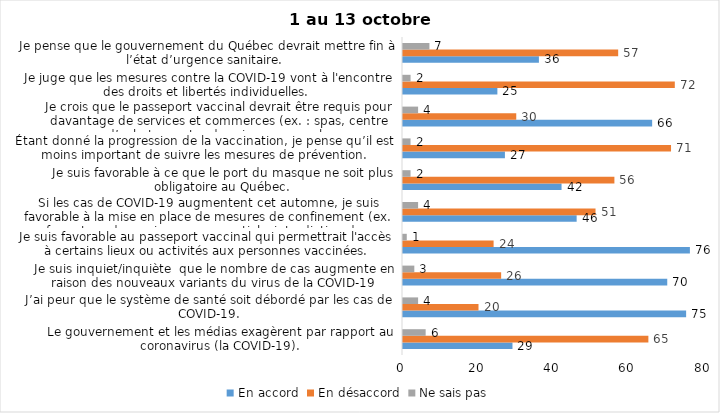
| Category | En accord | En désaccord | Ne sais pas |
|---|---|---|---|
| Le gouvernement et les médias exagèrent par rapport au coronavirus (la COVID-19). | 29 | 65 | 6 |
| J’ai peur que le système de santé soit débordé par les cas de COVID-19. | 75 | 20 | 4 |
| Je suis inquiet/inquiète  que le nombre de cas augmente en raison des nouveaux variants du virus de la COVID-19 | 70 | 26 | 3 |
| Je suis favorable au passeport vaccinal qui permettrait l'accès à certains lieux ou activités aux personnes vaccinées. | 76 | 24 | 1 |
| Si les cas de COVID-19 augmentent cet automne, je suis favorable à la mise en place de mesures de confinement (ex. fermeture de services non essentiels, interdiction des rassemblements privés) | 46 | 51 | 4 |
| Je suis favorable à ce que le port du masque ne soit plus obligatoire au Québec. | 42 | 56 | 2 |
| Étant donné la progression de la vaccination, je pense qu’il est moins important de suivre les mesures de prévention. | 27 | 71 | 2 |
| Je crois que le passeport vaccinal devrait être requis pour davantage de services et commerces (ex. : spas, centre d’achats, centre de soins personnels. | 66 | 30 | 4 |
| Je juge que les mesures contre la COVID-19 vont à l'encontre des droits et libertés individuelles.  | 25 | 72 | 2 |
| Je pense que le gouvernement du Québec devrait mettre fin à l’état d’urgence sanitaire.  | 36 | 57 | 7 |